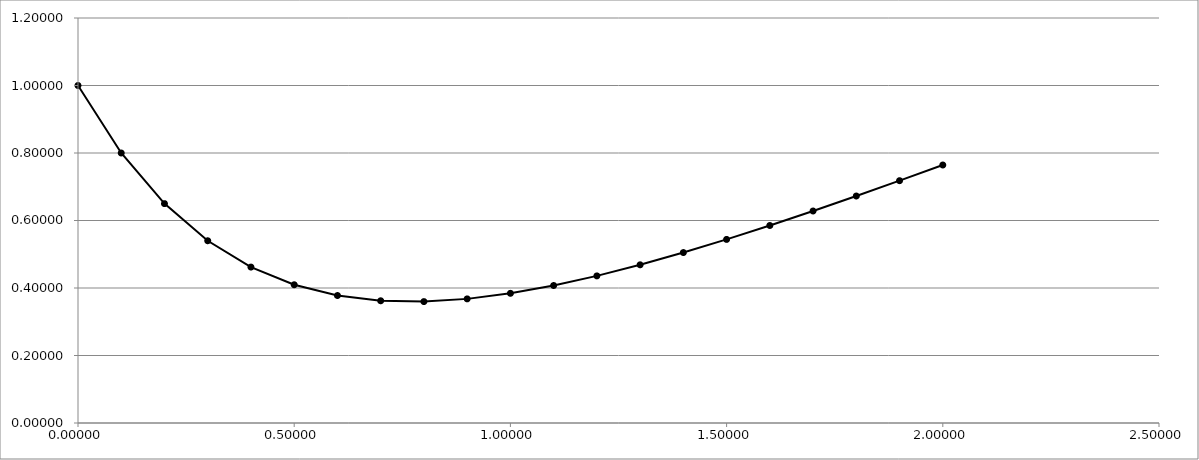
| Category | Series 0 |
|---|---|
| 0.0 | 1 |
| 0.1 | 0.8 |
| 0.2 | 0.65 |
| 0.30000000000000004 | 0.54 |
| 0.4 | 0.462 |
| 0.5 | 0.41 |
| 0.6 | 0.378 |
| 0.7 | 0.362 |
| 0.7999999999999999 | 0.36 |
| 0.8999999999999999 | 0.368 |
| 0.9999999999999999 | 0.384 |
| 1.0999999999999999 | 0.407 |
| 1.2 | 0.436 |
| 1.3 | 0.469 |
| 1.4000000000000001 | 0.505 |
| 1.5000000000000002 | 0.544 |
| 1.6000000000000003 | 0.585 |
| 1.7000000000000004 | 0.628 |
| 1.8000000000000005 | 0.673 |
| 1.9000000000000006 | 0.718 |
| 2.0000000000000004 | 0.764 |